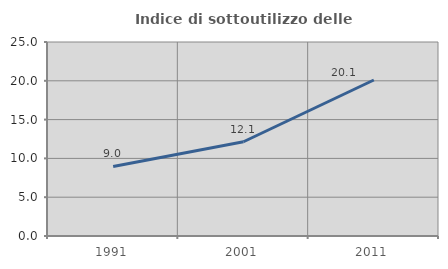
| Category | Indice di sottoutilizzo delle abitazioni  |
|---|---|
| 1991.0 | 8.962 |
| 2001.0 | 12.144 |
| 2011.0 | 20.104 |